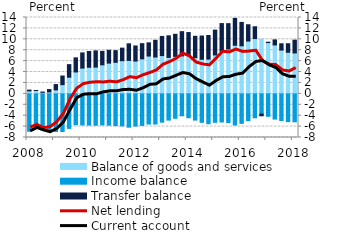
| Category | Balance of goods and services | Income balance | Transfer balance |
|---|---|---|---|
| 2008.0 | 0.542 | -6.855 | 0.144 |
| 2008.0 | 0.607 | -6.318 | 0.016 |
| 2008.0 | 0.276 | -6.627 | 0.057 |
| 2008.0 | 0.356 | -6.874 | 0.434 |
| 2009.0 | 0.725 | -6.896 | 0.982 |
| 2009.0 | 1.689 | -6.9 | 1.582 |
| 2009.0 | 3.052 | -6.333 | 2.306 |
| 2009.0 | 4.018 | -5.649 | 2.584 |
| 2010.0 | 4.723 | -5.709 | 2.785 |
| 2010.0 | 4.875 | -5.734 | 2.897 |
| 2010.0 | 4.906 | -5.753 | 2.976 |
| 2010.0 | 5.323 | -5.696 | 2.468 |
| 2011.0 | 5.632 | -5.751 | 2.353 |
| 2011.0 | 5.782 | -5.822 | 2.145 |
| 2011.0 | 6.075 | -5.873 | 2.309 |
| 2011.0 | 6.133 | -6.11 | 3.044 |
| 2012.0 | 6.016 | -5.905 | 2.764 |
| 2012.0 | 6.423 | -5.787 | 2.783 |
| 2012.0 | 6.938 | -5.537 | 2.417 |
| 2012.0 | 6.753 | -5.533 | 3.069 |
| 2013.0 | 7.019 | -5.186 | 3.511 |
| 2013.0 | 6.687 | -4.813 | 3.957 |
| 2013.0 | 6.877 | -4.482 | 4.041 |
| 2013.0 | 6.964 | -4.021 | 4.439 |
| 2014.0 | 7.045 | -4.377 | 4.196 |
| 2014.0 | 6.644 | -4.812 | 3.911 |
| 2014.0 | 6.34 | -5.216 | 4.266 |
| 2014.0 | 6.376 | -5.477 | 4.328 |
| 2015.0 | 7.133 | -5.219 | 4.55 |
| 2015.0 | 7.828 | -5.159 | 5.057 |
| 2015.0 | 8.226 | -5.27 | 4.646 |
| 2015.0 | 8.908 | -5.712 | 4.937 |
| 2016.0 | 8.812 | -5.41 | 4.288 |
| 2016.0 | 9.679 | -4.913 | 2.992 |
| 2016.0 | 10.136 | -4.389 | 2.166 |
| 2016.0 | 10.012 | -3.705 | -0.312 |
| 2017.0 | 9.401 | -4.113 | 0.071 |
| 2017.0 | 8.969 | -4.623 | 0.929 |
| 2017.0 | 8.032 | -4.882 | 1.153 |
| 2017.0 | 7.624 | -5.091 | 1.567 |
| 2018.0 | 7.501 | -5.124 | 2.347 |